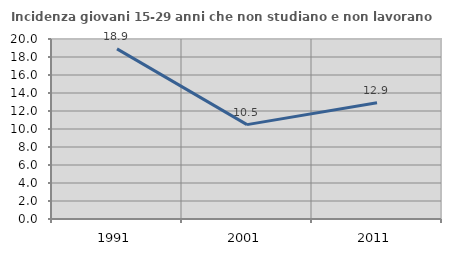
| Category | Incidenza giovani 15-29 anni che non studiano e non lavorano  |
|---|---|
| 1991.0 | 18.906 |
| 2001.0 | 10.487 |
| 2011.0 | 12.917 |